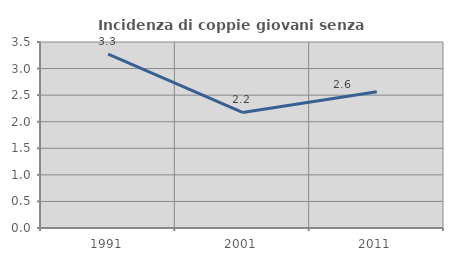
| Category | Incidenza di coppie giovani senza figli |
|---|---|
| 1991.0 | 3.273 |
| 2001.0 | 2.174 |
| 2011.0 | 2.564 |